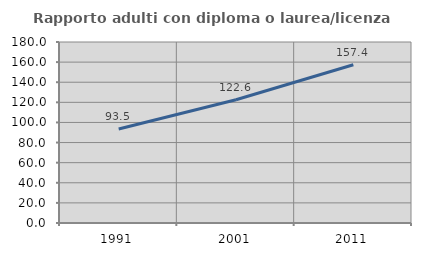
| Category | Rapporto adulti con diploma o laurea/licenza media  |
|---|---|
| 1991.0 | 93.513 |
| 2001.0 | 122.581 |
| 2011.0 | 157.382 |